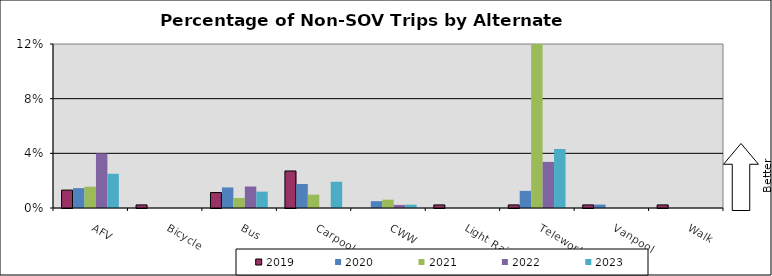
| Category | 2019 | 2020 | 2021 | 2022 | 2023 |
|---|---|---|---|---|---|
| AFV | 0.013 | 0.015 | 0.016 | 0.04 | 0.025 |
| Bicycle | 0.002 | 0 | 0 | 0 | 0 |
| Bus | 0.011 | 0.015 | 0.007 | 0.016 | 0.012 |
| Carpool | 0.027 | 0.018 | 0.01 | 0 | 0.019 |
| CWW | 0 | 0.005 | 0.006 | 0.002 | 0.002 |
| Light Rail | 0.002 | 0 | 0 | 0 | 0 |
| Telework | 0.002 | 0.013 | 0.132 | 0.034 | 0.043 |
| Vanpool | 0.002 | 0.003 | 0 | 0 | 0 |
| Walk | 0.002 | 0 | 0 | 0 | 0 |